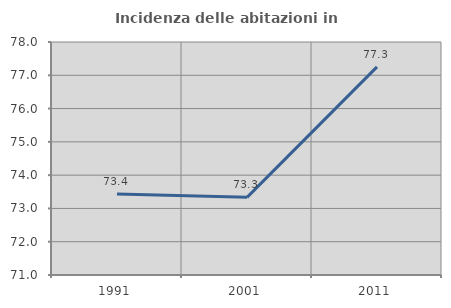
| Category | Incidenza delle abitazioni in proprietà  |
|---|---|
| 1991.0 | 73.436 |
| 2001.0 | 73.333 |
| 2011.0 | 77.252 |